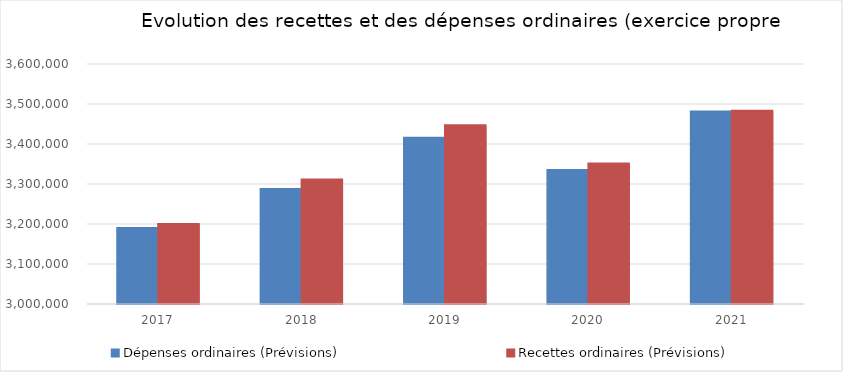
| Category | Dépenses ordinaires (Prévisions) | Recettes ordinaires (Prévisions) |
|---|---|---|
| 2017.0 | 3188736.62 | 3198602.6 |
| 2018.0 | 3286428.63 | 3310278.39 |
| 2019.0 | 3414583.8 | 3445914.2 |
| 2020.0 | 3333650.56 | 3350038.46 |
| 2021.0 | 3480005.01 | 3482155.75 |